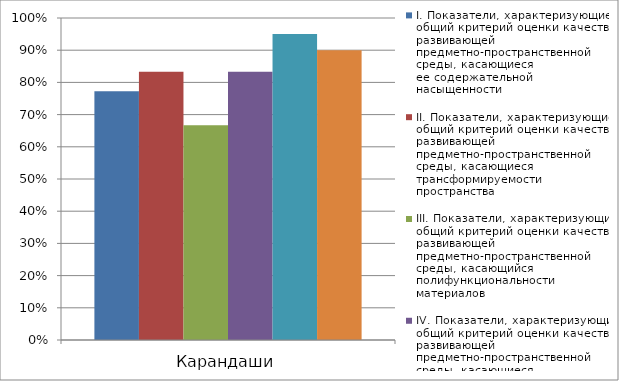
| Category | I. Показатели, характеризующие общий критерий оценки качества развивающей предметно-пространственной среды, касающиеся ее содержательной насыщенности | II. Показатели, характеризующие общий критерий оценки качества развивающей предметно-пространственной среды, касающиеся трансформируемости пространства | III. Показатели, характеризующие общий критерий оценки качества развивающей предметно-пространственной среды, касающийся полифункциональности материалов | IV. Показатели, характеризующие общий критерий оценки качества развивающей предметно-пространственной среды, касающиеся ее вариативности | V. Показатели, характеризующие общий критерий оценки качества развивающей предметно-пространственной среды, касающиеся ее доступности | VI. Показатели, характеризующие общий критерий оценки качества развивающей предметно-пространственной среды, касающиеся безопасности предметно-пространственной среды |
|---|---|---|---|---|---|---|
| Карандаши | 0.773 | 0.833 | 0.667 | 0.833 | 0.95 | 0.9 |